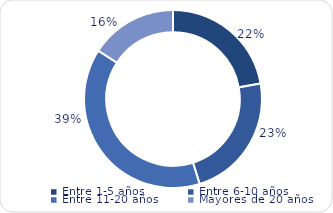
| Category | Series 0 |
|---|---|
| Entre 1-5 años | 3241.3 |
| Entre 6-10 años | 3347.6 |
| Entre 11-20 años | 5686.2 |
| Mayores de 20 años | 2313 |